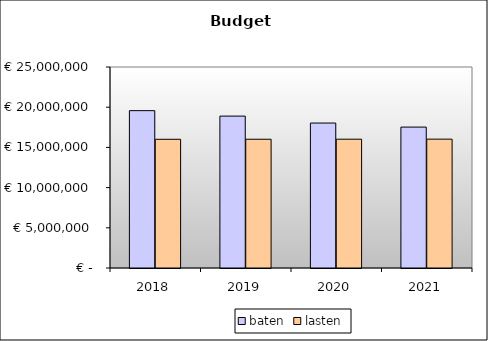
| Category | baten | lasten |
|---|---|---|
| 2018.0 | 19570710.449 | 16008787 |
| 2019.0 | 18892315.621 | 16014116.94 |
| 2020.0 | 18029311.57 | 16019901.18 |
| 2021.0 | 17525892.54 | 16026136.64 |